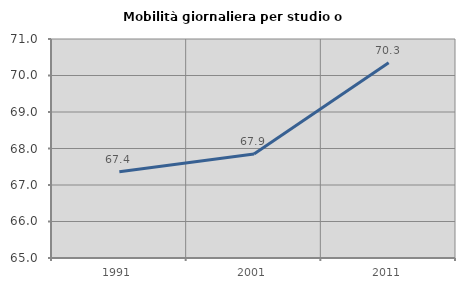
| Category | Mobilità giornaliera per studio o lavoro |
|---|---|
| 1991.0 | 67.362 |
| 2001.0 | 67.852 |
| 2011.0 | 70.349 |